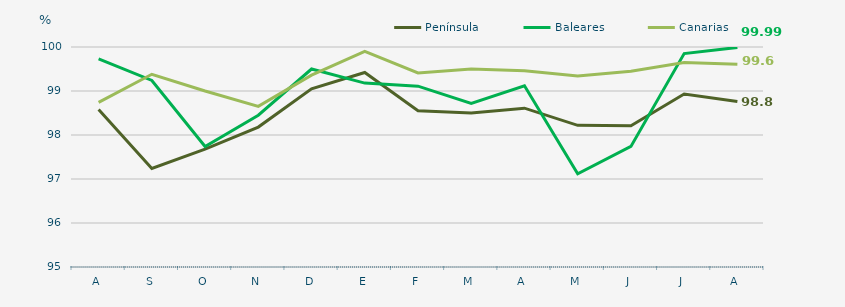
| Category | Península | Baleares | Canarias |
|---|---|---|---|
| A | 98.58 | 99.73 | 98.74 |
| S | 97.24 | 99.24 | 99.38 |
| O | 97.68 | 97.74 | 99 |
| N | 98.18 | 98.45 | 98.65 |
| D | 99.05 | 99.5 | 99.36 |
| E | 99.42 | 99.18 | 99.9 |
| F | 98.55 | 99.11 | 99.41 |
| M | 98.5 | 98.72 | 99.5 |
| A | 98.61 | 99.12 | 99.46 |
| M | 98.22 | 97.12 | 99.34 |
| J | 98.21 | 97.74 | 99.45 |
| J | 98.93 | 99.85 | 99.65 |
| A | 98.76 | 99.99 | 99.61 |